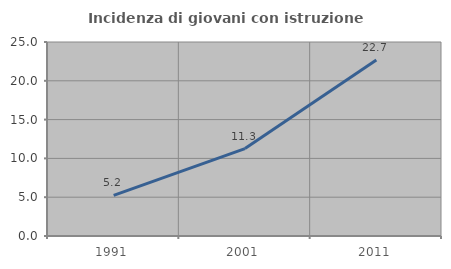
| Category | Incidenza di giovani con istruzione universitaria |
|---|---|
| 1991.0 | 5.243 |
| 2001.0 | 11.265 |
| 2011.0 | 22.683 |